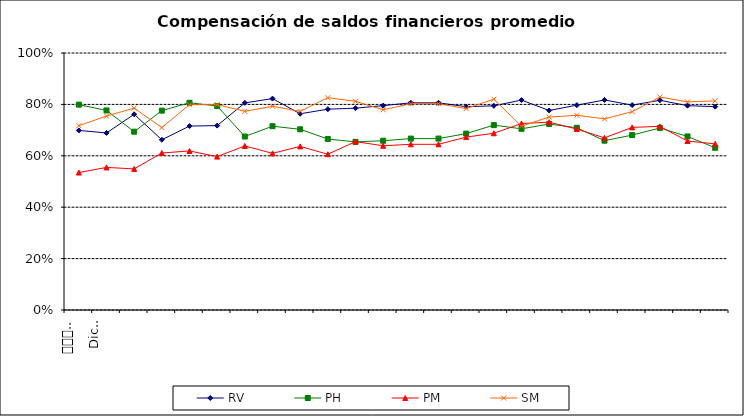
| Category | RV | PH | PM | SM |
|---|---|---|---|---|
| 0 | 0.699 | 0.799 | 0.535 | 0.717 |
| 1 | 0.689 | 0.776 | 0.555 | 0.755 |
| 2 | 0.762 | 0.694 | 0.549 | 0.786 |
| 3 | 0.662 | 0.776 | 0.611 | 0.71 |
| 4 | 0.716 | 0.806 | 0.619 | 0.799 |
| 5 | 0.718 | 0.794 | 0.597 | 0.799 |
| 6 | 0.806 | 0.675 | 0.638 | 0.773 |
| 7 | 0.823 | 0.715 | 0.61 | 0.793 |
| 8 | 0.764 | 0.703 | 0.637 | 0.773 |
| 9 | 0.781 | 0.665 | 0.606 | 0.826 |
| 10 | 0.785 | 0.654 | 0.655 | 0.812 |
| 11 | 0.795 | 0.659 | 0.639 | 0.779 |
| 12 | 0.806 | 0.667 | 0.645 | 0.803 |
| 13 | 0.806 | 0.667 | 0.645 | 0.803 |
| 14 | 0.791 | 0.686 | 0.673 | 0.784 |
| 15 | 0.794 | 0.719 | 0.688 | 0.82 |
| 16 | 0.817 | 0.705 | 0.726 | 0.715 |
| 17 | 0.776 | 0.724 | 0.731 | 0.751 |
| 18 | 0.797 | 0.709 | 0.704 | 0.758 |
| 19 | 0.817 | 0.659 | 0.67 | 0.744 |
| 20 | 0.797 | 0.681 | 0.711 | 0.772 |
| 21 | 0.816 | 0.708 | 0.715 | 0.829 |
| 22 | 0.795 | 0.675 | 0.657 | 0.81 |
| 23 | 0.791 | 0.631 | 0.646 | 0.814 |